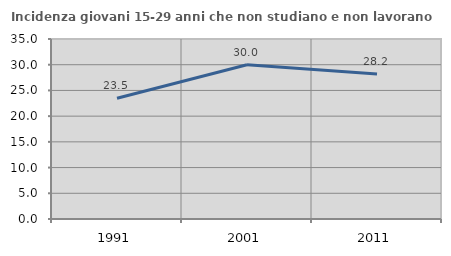
| Category | Incidenza giovani 15-29 anni che non studiano e non lavorano  |
|---|---|
| 1991.0 | 23.49 |
| 2001.0 | 30 |
| 2011.0 | 28.175 |